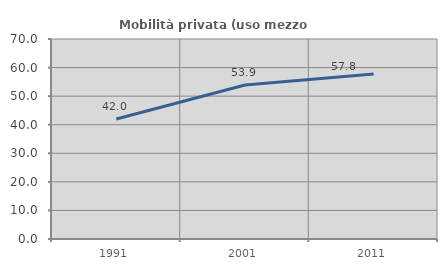
| Category | Mobilità privata (uso mezzo privato) |
|---|---|
| 1991.0 | 42.021 |
| 2001.0 | 53.893 |
| 2011.0 | 57.779 |